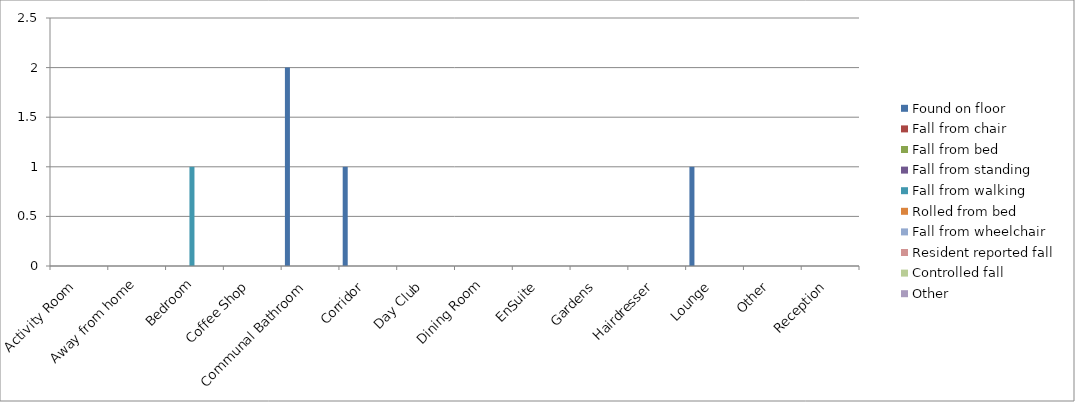
| Category | Found on floor | Fall from chair | Fall from bed | Fall from standing | Fall from walking | Rolled from bed | Fall from wheelchair | Resident reported fall | Controlled fall | Other |
|---|---|---|---|---|---|---|---|---|---|---|
| Activity Room | 0 | 0 | 0 | 0 | 0 | 0 | 0 | 0 | 0 | 0 |
| Away from home | 0 | 0 | 0 | 0 | 0 | 0 | 0 | 0 | 0 | 0 |
| Bedroom | 0 | 0 | 0 | 0 | 1 | 0 | 0 | 0 | 0 | 0 |
| Coffee Shop | 0 | 0 | 0 | 0 | 0 | 0 | 0 | 0 | 0 | 0 |
| Communal Bathroom | 2 | 0 | 0 | 0 | 0 | 0 | 0 | 0 | 0 | 0 |
| Corridor | 1 | 0 | 0 | 0 | 0 | 0 | 0 | 0 | 0 | 0 |
| Day Club | 0 | 0 | 0 | 0 | 0 | 0 | 0 | 0 | 0 | 0 |
| Dining Room | 0 | 0 | 0 | 0 | 0 | 0 | 0 | 0 | 0 | 0 |
| EnSuite | 0 | 0 | 0 | 0 | 0 | 0 | 0 | 0 | 0 | 0 |
| Gardens | 0 | 0 | 0 | 0 | 0 | 0 | 0 | 0 | 0 | 0 |
| Hairdresser | 0 | 0 | 0 | 0 | 0 | 0 | 0 | 0 | 0 | 0 |
| Lounge | 1 | 0 | 0 | 0 | 0 | 0 | 0 | 0 | 0 | 0 |
| Other | 0 | 0 | 0 | 0 | 0 | 0 | 0 | 0 | 0 | 0 |
| Reception | 0 | 0 | 0 | 0 | 0 | 0 | 0 | 0 | 0 | 0 |